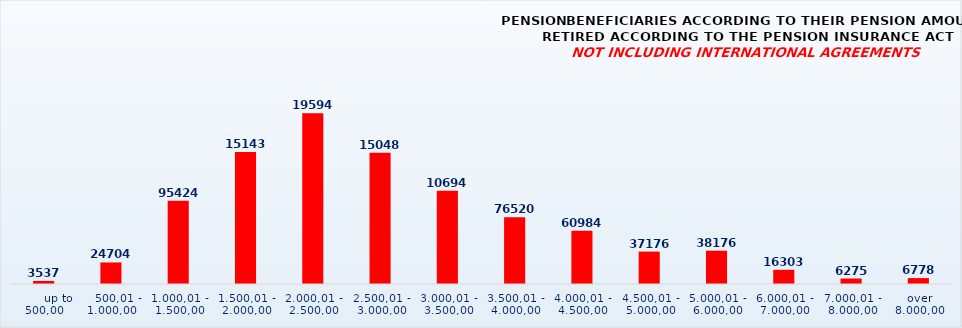
| Category | PENSION BENEFICIARIES ACCORDING TO TYPES AND AMOUNTS OF PENSION, RETIRED ACCORDING TO THE PENSION INSURANCE ACT
NOT INCLUDING INTERNATIONAL AGREEMENTS |
|---|---|
|       up to 500,00 | 3537 |
|    500,01 - 1.000,00 | 24704 |
| 1.000,01 - 1.500,00 | 95424 |
| 1.500,01 - 2.000,00 | 151438 |
| 2.000,01 - 2.500,00 | 195947 |
| 2.500,01 - 3.000,00 | 150481 |
| 3.000,01 - 3.500,00 | 106944 |
| 3.500,01 - 4.000,00 | 76520 |
| 4.000,01 - 4.500,00 | 60984 |
| 4.500,01 - 5.000,00 | 37176 |
| 5.000,01 - 6.000,00 | 38176 |
| 6.000,01 - 7.000,00 | 16303 |
| 7.000,01 - 8.000,00 | 6275 |
|  over  8.000,00 | 6778 |